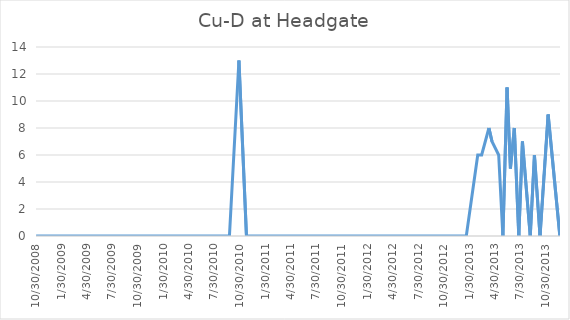
| Category | Cu-D |
|---|---|
| 10/30/08 | 0 |
| 11/6/08 | 0 |
| 12/18/08 | 0 |
| 1/15/09 | 0 |
| 2/23/09 | 0 |
| 3/11/09 | 0 |
| 4/9/09 | 0 |
| 4/20/09 | 0 |
| 5/21/09 | 0 |
| 5/27/09 | 0 |
| 6/11/09 | 0 |
| 6/23/09 | 0 |
| 7/13/09 | 0 |
| 7/27/09 | 0 |
| 8/12/09 | 0 |
| 9/21/09 | 0 |
| 10/19/09 | 0 |
| 11/4/09 | 0 |
| 12/17/09 | 0 |
| 1/28/10 | 0 |
| 2/18/10 | 0 |
| 3/10/10 | 0 |
| 4/12/10 | 0 |
| 4/26/10 | 0 |
| 5/12/10 | 0 |
| 5/27/10 | 0 |
| 6/10/10 | 0 |
| 6/30/10 | 0 |
| 7/12/10 | 0 |
| 7/26/10 | 0 |
| 8/31/10 | 0 |
| 9/22/10 | 0 |
| 10/26/10 | 13 |
| 11/22/10 | 0 |
| 12/21/10 | 0 |
| 1/20/11 | 0 |
| 2/23/11 | 0 |
| 3/31/11 | 0 |
| 4/11/11 | 0 |
| 4/26/11 | 0 |
| 5/11/11 | 0 |
| 5/25/11 | 0 |
| 6/9/11 | 0 |
| 6/27/11 | 0 |
| 7/12/11 | 0 |
| 7/28/11 | 0 |
| 8/12/11 | 0 |
| 9/13/11 | 0 |
| 10/6/11 | 0 |
| 11/8/11 | 0 |
| 12/19/11 | 0 |
| 1/25/12 | 0 |
| 2/28/12 | 0 |
| 3/29/12 | 0 |
| 4/11/12 | 0 |
| 4/24/12 | 0 |
| 5/8/12 | 0 |
| 5/21/12 | 0 |
| 6/5/12 | 0 |
| 6/18/12 | 0 |
| 7/12/12 | 0 |
| 8/21/12 | 0 |
| 9/11/12 | 0 |
| 10/10/12 | 0 |
| 11/28/12 | 0 |
| 12/27/12 | 0 |
| 1/17/13 | 0 |
| 2/27/13 | 6 |
| 3/13/13 | 6 |
| 4/8/13 | 8 |
| 4/19/13 | 7 |
| 5/13/13 | 6 |
| 5/28/13 | 0 |
| 6/12/13 | 11 |
| 6/24/13 | 5 |
| 7/8/13 | 8 |
| 7/24/13 | 0 |
| 8/6/13 | 7 |
| 9/3/13 | 0 |
| 9/18/13 | 6 |
| 10/8/13 | 0 |
| 11/6/13 | 9 |
| 12/18/13 | 0 |